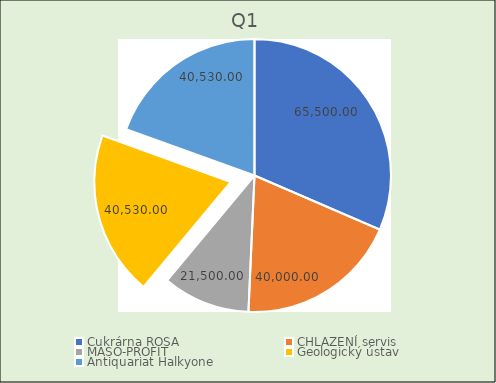
| Category | Q1 | Q2 | Q3 | Q4 |
|---|---|---|---|---|
| Cukrárna ROSA | 65500 | 0 | 40500 | 0 |
| CHLAZENÍ servis | 40000 | 0 | 0 | 0 |
| MASO-PROFIT | 21500 | 0 | 0 | 0 |
| Geologický ústav | 40530 | 0 | 0 | 0 |
| Antiquariat Halkyone | 40530 | 0 | 0 | 0 |